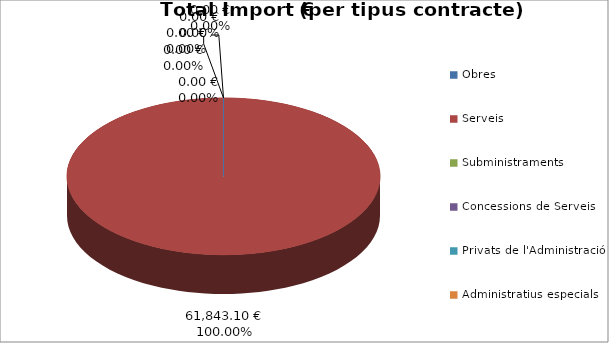
| Category | Total preu              (amb iva) |
|---|---|
| Obres | 0 |
| Serveis | 61843.1 |
| Subministraments | 0 |
| Concessions de Serveis | 0 |
| Privats de l'Administració | 0 |
| Administratius especials | 0 |